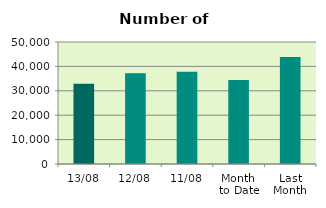
| Category | Series 0 |
|---|---|
| 13/08 | 32848 |
| 12/08 | 37228 |
| 11/08 | 37778 |
| Month 
to Date | 34390.667 |
| Last
Month | 43867.217 |